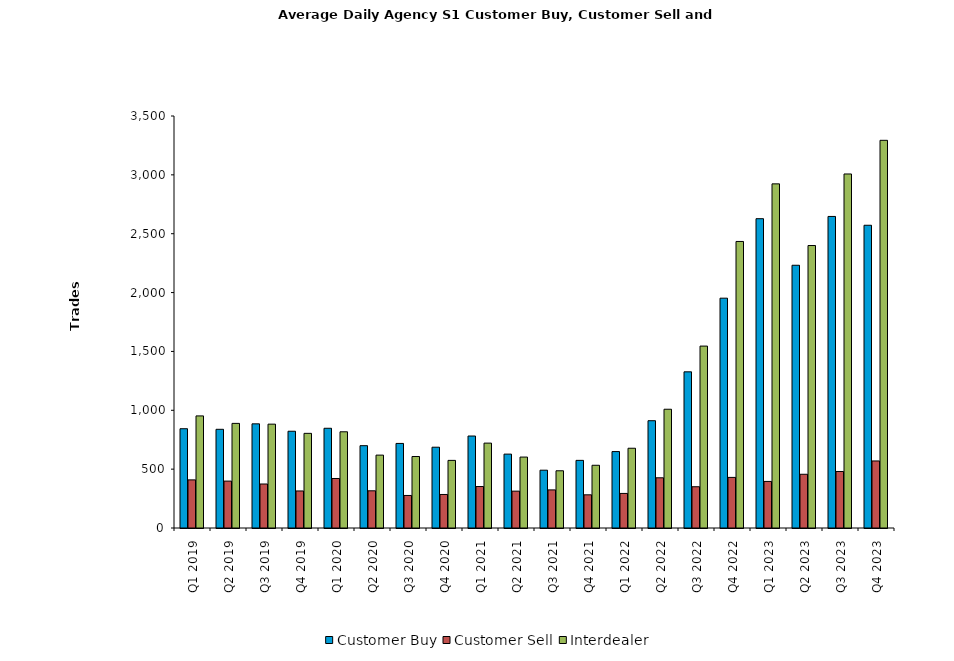
| Category | Customer Buy | Customer Sell | Interdealer |
|---|---|---|---|
| Q1 2019 | 843.295 | 408.787 | 952.246 |
| Q2 2019 | 838.492 | 398.349 | 888.746 |
| Q3 2019 | 884.844 | 373.766 | 882.172 |
| Q4 2019 | 821.906 | 314.656 | 804 |
| Q1 2020 | 847.161 | 420.581 | 817.339 |
| Q2 2020 | 699.365 | 315.984 | 619.127 |
| Q3 2020 | 718.391 | 276.359 | 607.312 |
| Q4 2020 | 686.266 | 284.797 | 574.438 |
| Q1 2021 | 781.328 | 352.377 | 721.082 |
| Q2 2021 | 627.587 | 313.111 | 602.508 |
| Q3 2021 | 491 | 323.672 | 486.188 |
| Q4 2021 | 574.609 | 281.906 | 532.891 |
| Q1 2022 | 649.323 | 293.629 | 677.516 |
| Q2 2022 | 911.403 | 426.532 | 1008.855 |
| Q3 2022 | 1326.641 | 350.516 | 1545.344 |
| Q4 2022 | 1952.317 | 429.825 | 2434.175 |
| Q1 2023 | 2627.548 | 395.677 | 2923.484 |
| Q2 2023 | 2232.081 | 456.355 | 2399.645 |
| Q3 2023 | 2646.73 | 480.079 | 3007.476 |
| Q4 2023 | 2571.81 | 569.54 | 3293.444 |